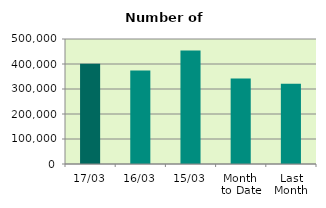
| Category | Series 0 |
|---|---|
| 17/03 | 401304 |
| 16/03 | 374124 |
| 15/03 | 454328 |
| Month 
to Date | 341528.769 |
| Last
Month | 321374.6 |